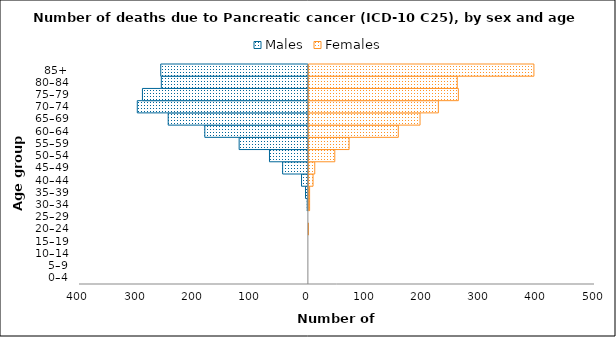
| Category | Males | Females |
|---|---|---|
| 0–4 | 0 | 0 |
| 5–9 | 0 | 0 |
| 10–14 | 0 | 0 |
| 15–19 | 0 | 0 |
| 20–24 | 0 | 1 |
| 25–29 | 0 | 0 |
| 30–34 | -2 | 3 |
| 35–39 | -5 | 3 |
| 40–44 | -12 | 9 |
| 45–49 | -45 | 12 |
| 50–54 | -68 | 47 |
| 55–59 | -121 | 72 |
| 60–64 | -181 | 158 |
| 65–69 | -245 | 196 |
| 70–74 | -299 | 228 |
| 75–79 | -290 | 263 |
| 80–84 | -257 | 261 |
| 85+ | -258 | 395 |